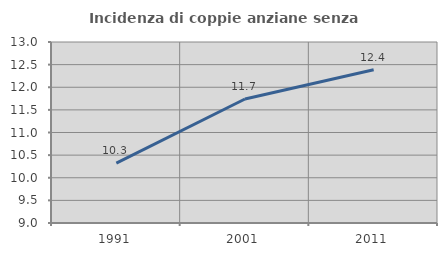
| Category | Incidenza di coppie anziane senza figli  |
|---|---|
| 1991.0 | 10.324 |
| 2001.0 | 11.74 |
| 2011.0 | 12.386 |